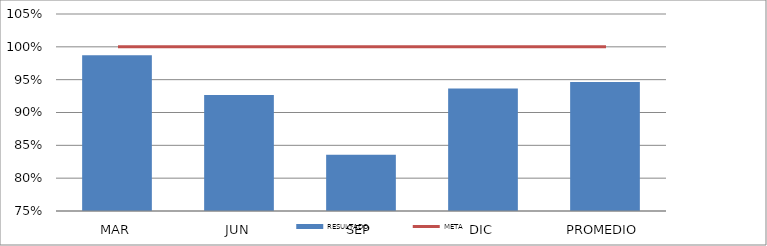
| Category | RESULTADO |
|---|---|
| MAR | 0.987 |
| JUN | 0.927 |
| SEP | 0.836 |
| DIC | 0.936 |
| PROMEDIO | 0.946 |